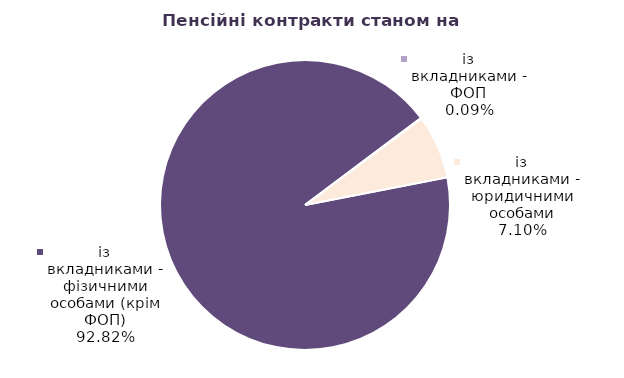
| Category | Series 0 |
|---|---|
| із вкладниками - фізичними особами (крім ФОП) | 86929 |
| із вкладниками - ФОП | 84 |
| із вкладниками - юридичними особами | 6644 |